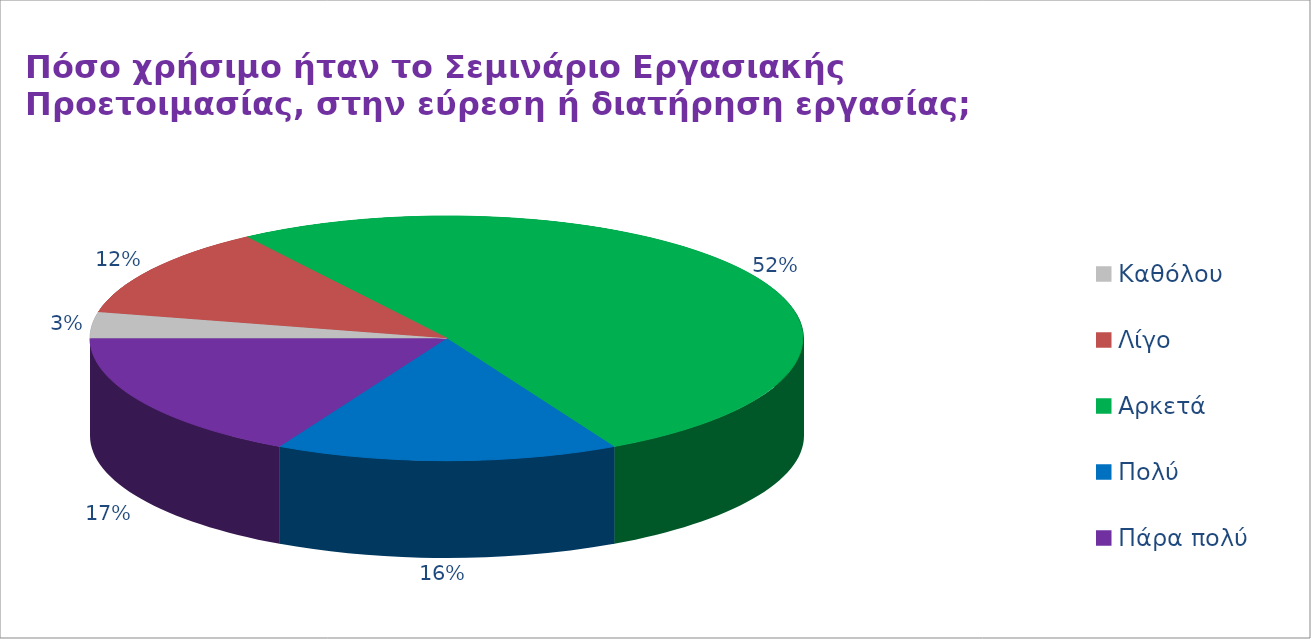
| Category | Series 2 | Series 1 | Series 0 |
|---|---|---|---|
| Καθόλου | 2 | 6 | 2 |
| Λίγο | 7 | 13 | 7 |
| Αρκετά | 30 | 12 | 30 |
| Πολύ | 9 | 14 | 9 |
| Πάρα πολύ | 10 | 13 | 10 |